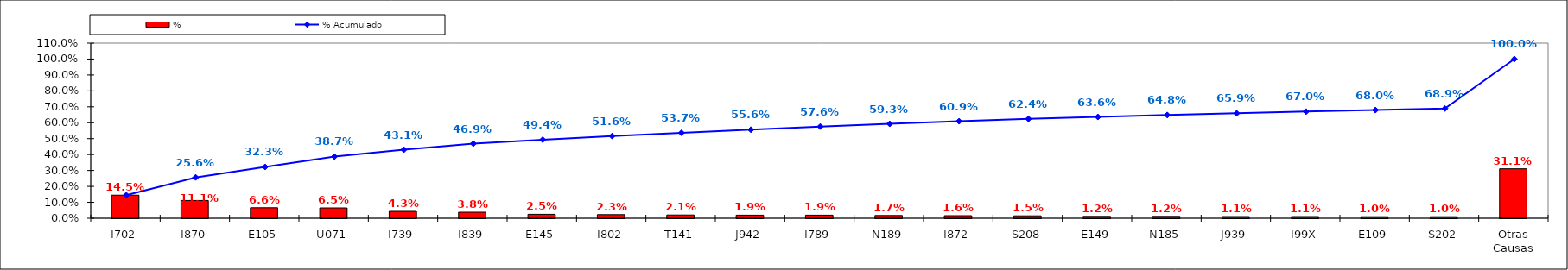
| Category | % |
|---|---|
| I702 | 0.145 |
| I870 | 0.111 |
| E105 | 0.066 |
| U071 | 0.065 |
| I739 | 0.043 |
| I839 | 0.038 |
| E145 | 0.025 |
| I802 | 0.023 |
| T141 | 0.021 |
| J942 | 0.019 |
| I789 | 0.019 |
| N189 | 0.017 |
| I872 | 0.016 |
| S208 | 0.015 |
| E149 | 0.012 |
| N185 | 0.012 |
| J939 | 0.011 |
| I99X | 0.011 |
| E109 | 0.01 |
| S202 | 0.01 |
| Otras Causas | 0.311 |